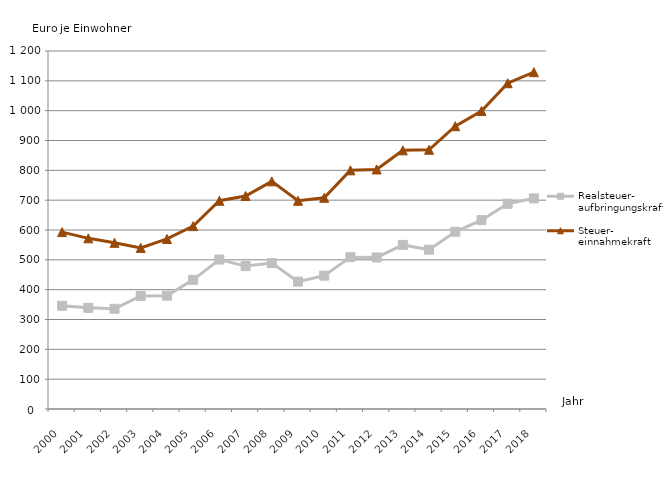
| Category | Realsteuer-
aufbringungskraft | Steuer-
einnahmekraft |
|---|---|---|
| 2000.0 | 346 | 593 |
| 2001.0 | 339 | 572 |
| 2002.0 | 336 | 557 |
| 2003.0 | 379 | 540 |
| 2004.0 | 380 | 570 |
| 2005.0 | 433 | 613 |
| 2006.0 | 501 | 698 |
| 2007.0 | 479 | 714 |
| 2008.0 | 489 | 763 |
| 2009.0 | 427 | 698 |
| 2010.0 | 447 | 708 |
| 2011.0 | 509 | 800 |
| 2012.0 | 508 | 803 |
| 2013.0 | 550 | 867 |
| 2014.0 | 534 | 869 |
| 2015.0 | 594 | 948 |
| 2016.0 | 633 | 999 |
| 2017.0 | 688 | 1092 |
| 2018.0 | 706 | 1129 |